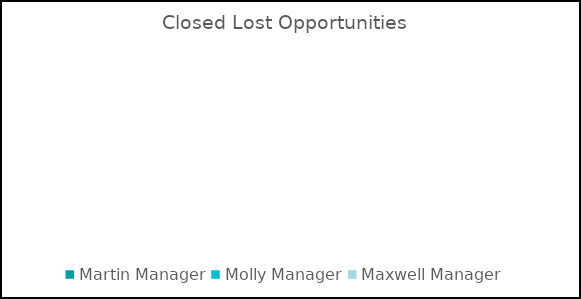
| Category | Closed Lost Opportunities |
|---|---|
| Martin Manager | 0 |
| Molly Manager | 0 |
| Maxwell Manager  | 0 |